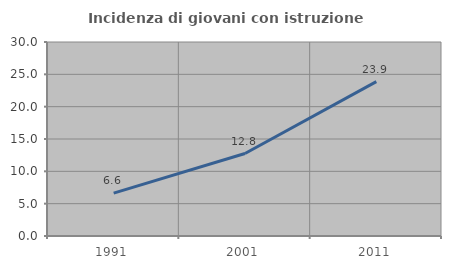
| Category | Incidenza di giovani con istruzione universitaria |
|---|---|
| 1991.0 | 6.623 |
| 2001.0 | 12.753 |
| 2011.0 | 23.865 |